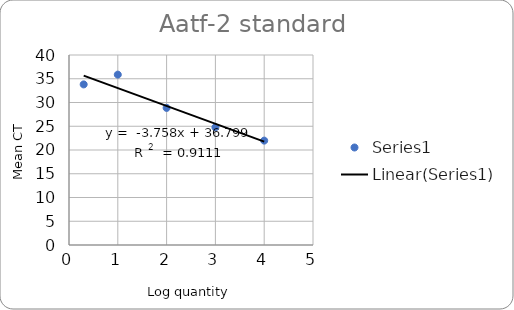
| Category | Series 0 |
|---|---|
| 4.0 | 21.975 |
| 2.0 | 28.856 |
| 3.0 | 24.777 |
| 1.0 | 35.867 |
| 0.3010299956639812 | 33.809 |